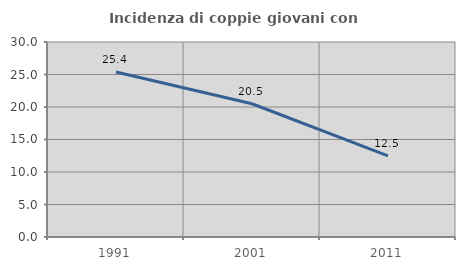
| Category | Incidenza di coppie giovani con figli |
|---|---|
| 1991.0 | 25.38 |
| 2001.0 | 20.501 |
| 2011.0 | 12.482 |